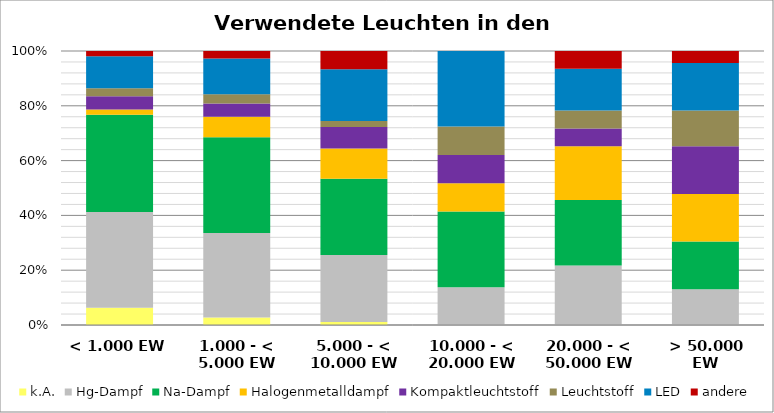
| Category | k.A. | Hg-Dampf | Na-Dampf | Halogenmetalldampf | Kompaktleuchtstoff | Leuchtstoff | LED | andere |
|---|---|---|---|---|---|---|---|---|
| < 1.000 EW | 13 | 72 | 73 | 4 | 10 | 6 | 24 | 4 |
| 1.000 - < 5.000 EW | 4 | 45 | 51 | 11 | 7 | 5 | 19 | 4 |
| 5.000 - < 10.000 EW | 1 | 22 | 25 | 10 | 7 | 2 | 17 | 6 |
| 10.000 - < 20.000 EW | 0 | 4 | 8 | 3 | 3 | 3 | 8 | 0 |
| 20.000 - < 50.000 EW | 0 | 10 | 11 | 9 | 3 | 3 | 7 | 3 |
| > 50.000 EW | 0 | 3 | 4 | 4 | 4 | 3 | 4 | 1 |